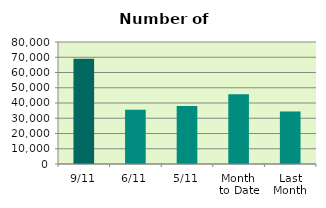
| Category | Series 0 |
|---|---|
| 9/11 | 69012 |
| 6/11 | 35586 |
| 5/11 | 38022 |
| Month 
to Date | 45717 |
| Last
Month | 34490.636 |